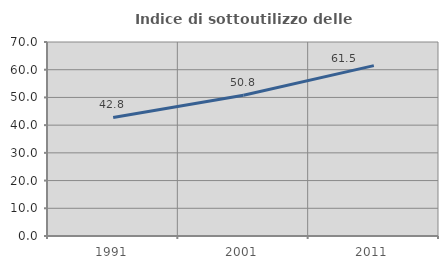
| Category | Indice di sottoutilizzo delle abitazioni  |
|---|---|
| 1991.0 | 42.759 |
| 2001.0 | 50.769 |
| 2011.0 | 61.475 |